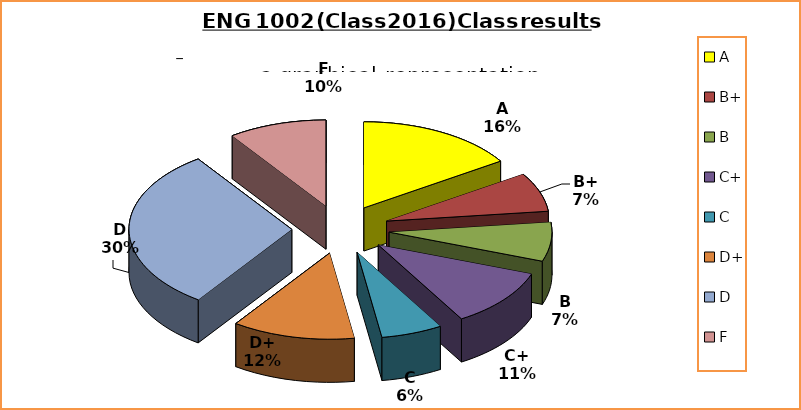
| Category | Series 0 |
|---|---|
| A | 13 |
| B+ | 6 |
| B | 6 |
| C+ | 9 |
| C | 5 |
| D+ | 10 |
| D | 25 |
| F | 8 |